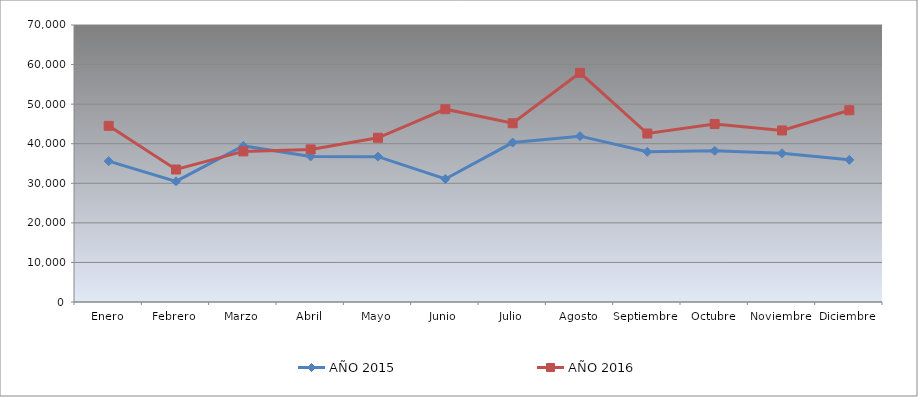
| Category | AÑO 2015 | AÑO 2016 |
|---|---|---|
| Enero | 35594.927 | 44515.731 |
| Febrero | 30490.56 | 33483.924 |
| Marzo | 39446.403 | 38056.903 |
| Abril | 36794.274 | 38562.764 |
| Mayo | 36733.593 | 41504.849 |
| Junio | 31090.234 | 48728.538 |
| Julio | 40292.372 | 45171.326 |
| Agosto | 41909.35 | 57919.013 |
| Septiembre | 37961.497 | 42577.273 |
| Octubre | 38222.069 | 44989.217 |
| Noviembre | 37583.131 | 43350.228 |
| Diciembre | 35923.319 | 48453.35 |